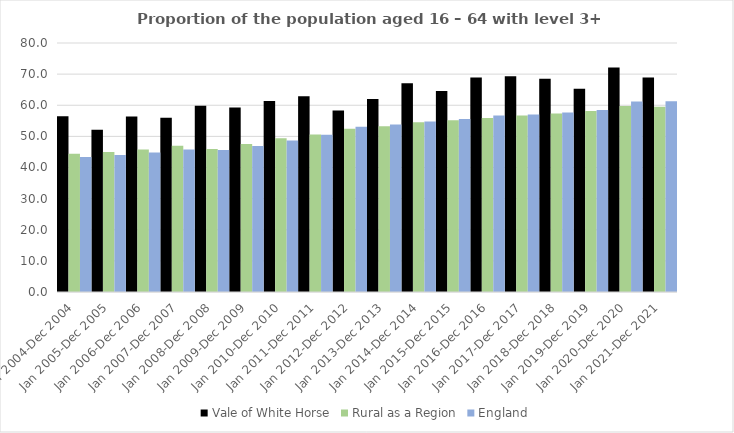
| Category | Vale of White Horse | Rural as a Region | England |
|---|---|---|---|
| Jan 2004-Dec 2004 | 56.5 | 44.405 | 43.4 |
| Jan 2005-Dec 2005 | 52.1 | 44.973 | 44 |
| Jan 2006-Dec 2006 | 56.4 | 45.774 | 44.8 |
| Jan 2007-Dec 2007 | 56 | 46.968 | 45.8 |
| Jan 2008-Dec 2008 | 59.8 | 45.964 | 45.6 |
| Jan 2009-Dec 2009 | 59.3 | 47.59 | 46.9 |
| Jan 2010-Dec 2010 | 61.4 | 49.362 | 48.7 |
| Jan 2011-Dec 2011 | 62.9 | 50.602 | 50.5 |
| Jan 2012-Dec 2012 | 58.3 | 52.439 | 53.1 |
| Jan 2013-Dec 2013 | 62 | 53.276 | 53.8 |
| Jan 2014-Dec 2014 | 67.1 | 54.57 | 54.8 |
| Jan 2015-Dec 2015 | 64.6 | 55.16 | 55.6 |
| Jan 2016-Dec 2016 | 68.9 | 55.941 | 56.7 |
| Jan 2017-Dec 2017 | 69.3 | 56.689 | 57 |
| Jan 2018-Dec 2018 | 68.5 | 57.389 | 57.7 |
| Jan 2019-Dec 2019 | 65.3 | 58.147 | 58.5 |
| Jan 2020-Dec 2020 | 72.1 | 59.771 | 61.2 |
| Jan 2021-Dec 2021 | 68.9 | 59.54 | 61.3 |